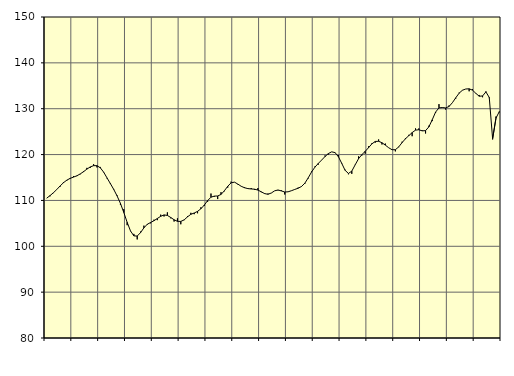
| Category | Piggar | Samtliga anställda (inkl. anställda utomlands) |
|---|---|---|
| nan | 110.5 | 110.49 |
| 87.0 | 110.9 | 111.05 |
| 87.0 | 111.6 | 111.67 |
| 87.0 | 112.4 | 112.37 |
| nan | 113 | 113.15 |
| 88.0 | 114 | 113.86 |
| 88.0 | 114.3 | 114.42 |
| 88.0 | 114.7 | 114.81 |
| nan | 115.3 | 115.09 |
| 89.0 | 115.3 | 115.37 |
| 89.0 | 115.7 | 115.78 |
| 89.0 | 116.4 | 116.27 |
| nan | 117.1 | 116.83 |
| 90.0 | 117.1 | 117.31 |
| 90.0 | 117.9 | 117.58 |
| 90.0 | 117.2 | 117.58 |
| nan | 117.3 | 117.11 |
| 91.0 | 116.1 | 116.16 |
| 91.0 | 114.8 | 114.91 |
| 91.0 | 113.8 | 113.67 |
| nan | 112.5 | 112.4 |
| 92.0 | 111.1 | 110.98 |
| 92.0 | 109 | 109.35 |
| 92.0 | 108.1 | 107.38 |
| nan | 104.6 | 105.23 |
| 93.0 | 103.3 | 103.35 |
| 93.0 | 102.7 | 102.27 |
| 93.0 | 101.5 | 102.23 |
| nan | 103.2 | 102.98 |
| 94.0 | 104.5 | 104.02 |
| 94.0 | 104.7 | 104.8 |
| 94.0 | 105 | 105.19 |
| nan | 105.8 | 105.58 |
| 95.0 | 105.7 | 106.06 |
| 95.0 | 106.9 | 106.53 |
| 95.0 | 106.5 | 106.84 |
| nan | 107.4 | 106.73 |
| 96.0 | 106.1 | 106.28 |
| 96.0 | 105.4 | 105.79 |
| 96.0 | 106.1 | 105.44 |
| nan | 104.8 | 105.42 |
| 97.0 | 105.7 | 105.76 |
| 97.0 | 106.6 | 106.42 |
| 97.0 | 107.3 | 106.97 |
| nan | 107 | 107.26 |
| 98.0 | 107.2 | 107.61 |
| 98.0 | 108.5 | 108.18 |
| 98.0 | 108.8 | 108.98 |
| nan | 109.7 | 109.96 |
| 99.0 | 111.5 | 110.71 |
| 99.0 | 110.8 | 110.94 |
| 99.0 | 110.3 | 110.97 |
| nan | 111.8 | 111.3 |
| 0.0 | 112 | 112.11 |
| 0.0 | 112.8 | 113.09 |
| 0.0 | 114.1 | 113.83 |
| nan | 114 | 113.99 |
| 1.0 | 113.5 | 113.57 |
| 1.0 | 113.1 | 113.09 |
| 1.0 | 112.9 | 112.77 |
| nan | 112.5 | 112.58 |
| 2.0 | 112.7 | 112.5 |
| 2.0 | 112.3 | 112.45 |
| 2.0 | 112.7 | 112.26 |
| nan | 111.8 | 111.88 |
| 3.0 | 111.4 | 111.49 |
| 3.0 | 111.5 | 111.34 |
| 3.0 | 111.6 | 111.62 |
| nan | 112.1 | 112.1 |
| 4.0 | 112.2 | 112.28 |
| 4.0 | 112.2 | 112.07 |
| 4.0 | 111.3 | 111.84 |
| nan | 111.9 | 111.88 |
| 5.0 | 112.1 | 112.12 |
| 5.0 | 112.4 | 112.4 |
| 5.0 | 112.8 | 112.66 |
| nan | 113.1 | 113.04 |
| 6.0 | 113.6 | 113.76 |
| 6.0 | 114.8 | 114.92 |
| 6.0 | 116.3 | 116.2 |
| nan | 117.4 | 117.25 |
| 7.0 | 117.8 | 118.06 |
| 7.0 | 118.8 | 118.8 |
| 7.0 | 119.8 | 119.56 |
| nan | 120 | 120.21 |
| 8.0 | 120.6 | 120.6 |
| 8.0 | 120.5 | 120.43 |
| 8.0 | 119.9 | 119.54 |
| nan | 118 | 118.09 |
| 9.0 | 116.7 | 116.57 |
| 9.0 | 115.7 | 115.88 |
| 9.0 | 115.8 | 116.39 |
| nan | 117.8 | 117.75 |
| 10.0 | 119.6 | 119.08 |
| 10.0 | 119.8 | 119.98 |
| 10.0 | 120.2 | 120.71 |
| nan | 121.8 | 121.5 |
| 11.0 | 122.5 | 122.34 |
| 11.0 | 122.6 | 122.86 |
| 11.0 | 123.3 | 122.9 |
| nan | 122.2 | 122.58 |
| 12.0 | 122.4 | 122.06 |
| 12.0 | 121.5 | 121.49 |
| 12.0 | 121.1 | 121.06 |
| nan | 120.7 | 121.06 |
| 13.0 | 121.6 | 121.68 |
| 13.0 | 122.8 | 122.61 |
| 13.0 | 123.6 | 123.44 |
| nan | 124.3 | 124.12 |
| 14.0 | 124 | 124.79 |
| 14.0 | 125.7 | 125.33 |
| 14.0 | 125.7 | 125.41 |
| nan | 125.3 | 125.17 |
| 15.0 | 124.6 | 125.22 |
| 15.0 | 126.3 | 126.05 |
| 15.0 | 127.3 | 127.6 |
| nan | 129.1 | 129.28 |
| 16.0 | 131 | 130.18 |
| 16.0 | 130.3 | 130.26 |
| 16.0 | 129.8 | 130.17 |
| nan | 130.7 | 130.48 |
| 17.0 | 131.3 | 131.31 |
| 17.0 | 132.2 | 132.38 |
| 17.0 | 133.5 | 133.38 |
| nan | 134 | 134.03 |
| 18.0 | 134.3 | 134.3 |
| 18.0 | 133.8 | 134.34 |
| 18.0 | 134.3 | 134.05 |
| nan | 133.4 | 133.35 |
| 19.0 | 133 | 132.72 |
| 19.0 | 132.5 | 132.78 |
| 19.0 | 133.8 | 133.67 |
| nan | 132.3 | 132.45 |
| 20.0 | 123.3 | 123.46 |
| 20.0 | 128.3 | 127.95 |
| 20.0 | 129.2 | 129.38 |